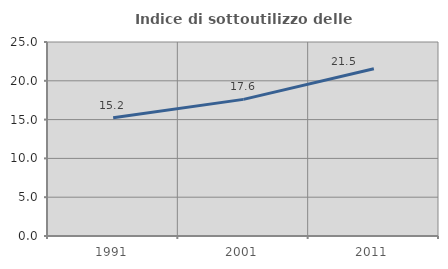
| Category | Indice di sottoutilizzo delle abitazioni  |
|---|---|
| 1991.0 | 15.225 |
| 2001.0 | 17.607 |
| 2011.0 | 21.547 |